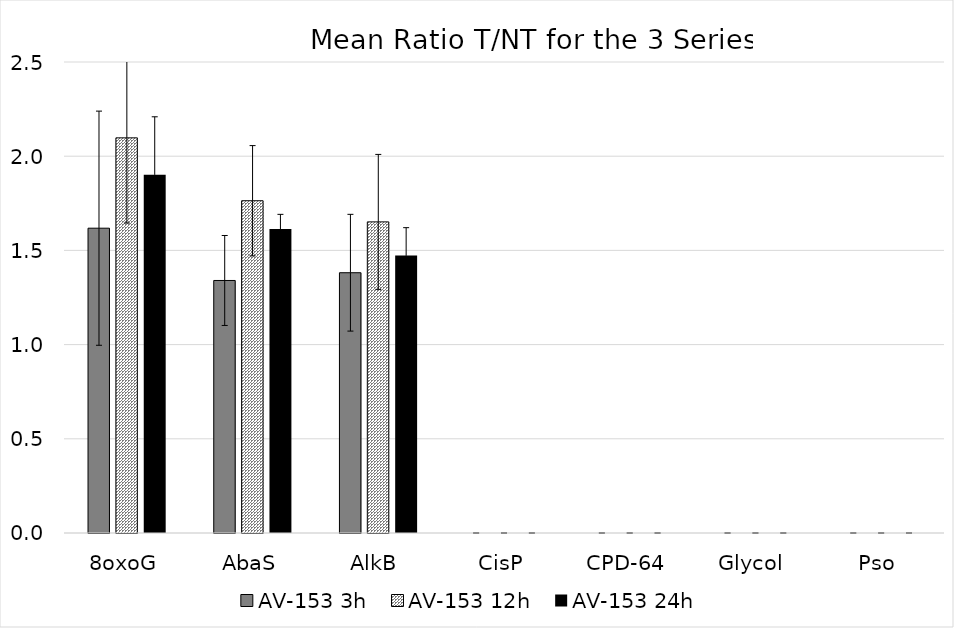
| Category | AV-153 3h  | AV-153 12h  | AV-153 24h  |
|---|---|---|---|
| 8oxoG | 1.618 | 2.097 | 1.901 |
| AbaS | 1.34 | 1.764 | 1.613 |
| AlkB | 1.382 | 1.651 | 1.473 |
| CisP | 0 | 0 | 0 |
| CPD-64 | 0 | 0 | 0 |
| Glycol | 0 | 0 | 0 |
| Pso | 0 | 0 | 0 |